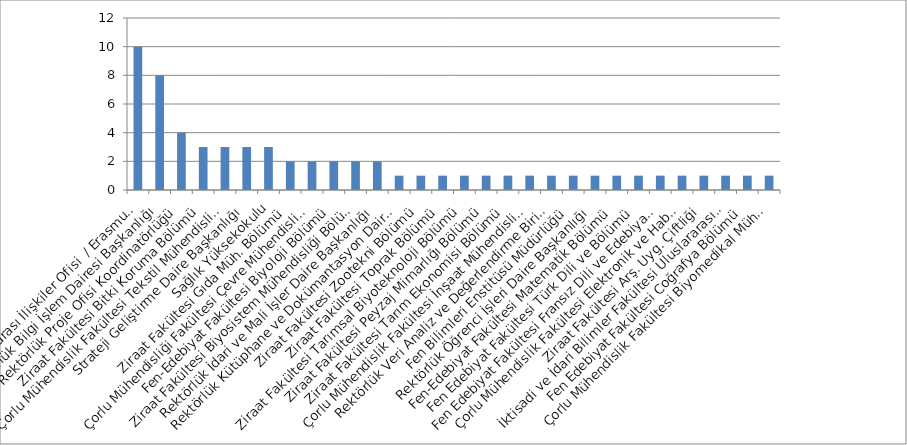
| Category | Series 0 |
|---|---|
| Rektörlük Uluslararası İlişkiler Ofisi  / Erasmus Değişim Programı Koord. | 10 |
| Rektörlük Bilgi İşlem Dairesi Başkanlığı | 8 |
| Rektörlük Proje Ofisi Koordinatörlüğü | 4 |
| Ziraat Fakültesi Bitki Koruma Bölümü | 3 |
| Çorlu Mühendislik Fakültesi Tekstil Mühendisliği Bölümü | 3 |
| Strateji Geliştirme Daire Başkanlığı | 3 |
| Sağlık Yüksekokulu | 3 |
| Ziraat Fakültesi Gıda Müh. Bölümü | 2 |
| Çorlu Mühendisliği Fakültesi Çevre Mühendisliği Bölümü | 2 |
| Fen-Edebiyat Fakültesi Biyoloji Bölümü | 2 |
| Ziraat Fakültesi Biyosistem Mühendisliği Bölümü | 2 |
| Rektörlük İdari ve Mali İşler Daire Başkanlığı | 2 |
| Rektörlük Kütüphane ve Dokümantasyon Daire Başkanlığı | 1 |
| Ziraat Fakültesi Zootekni Bölümü | 1 |
| Ziraat Fakültesi Toprak Bölümü | 1 |
| Ziraat Fakültesi Tarımsal Biyoteknoloji Bölümü | 1 |
| Ziraat Fakültesi Peyzaj Mimarlığı Bölümü | 1 |
| Ziraat Fakültesi Tarım Ekonomisi Bölümü | 1 |
| Çorlu Mühendislik Fakültesi İnşaat Mühendisliği Bölümü | 1 |
| Rektörlük Veri Analiz ve Değerlendirme Birimi | 1 |
| Fen Bilimleri Enstitüsü Müdürlüğü | 1 |
| Rektörlük Öğrenci İşleri Daire Başkanlığı | 1 |
| Fen-Edebiyat Fakültesi Matematik Bölümü | 1 |
| Fen Edebiyat Fakültesi Türk Dili ve Bölümü | 1 |
| Fen Edebiyat Fakültesi Fransız Dili ve Edebiyatı Bölümü | 1 |
| Çorlu Mühendislik Fakültesi Elektronik ve Haberleşme Mühendisliği Bölümü | 1 |
| Ziraat Fakültesi Arş. Uyg. Çiftliği | 1 |
| İktisadi ve İdari Bilimler Fakültesi Uluslararası İlişkiler Bölümü | 1 |
| Fen Edebiyat Fakültesi Coğrafya Bölümü | 1 |
| Çorlu Mühendislik Fakültesi Biyomedikal Mühendisliği Bölümü | 1 |